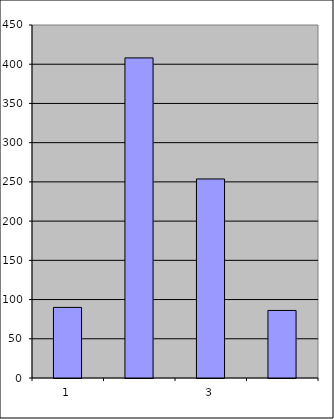
| Category | Series 0 |
|---|---|
| 0 | 90 |
| 1 | 408.034 |
| 2 | 253.723 |
| 3 | 86.118 |